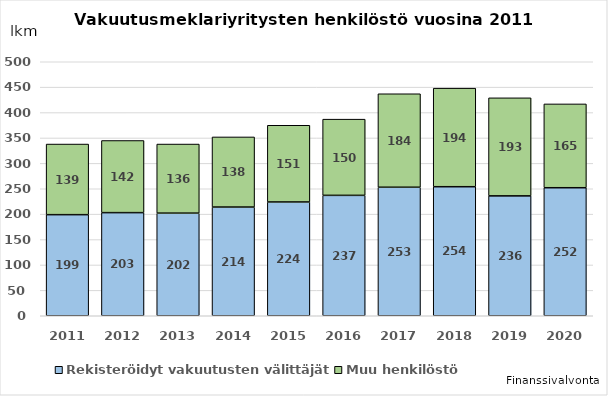
| Category | Rekisteröidyt vakuutusten välittäjät  | Muu henkilöstö |
|---|---|---|
| 2011.0 | 199 | 139 |
| 2012.0 | 203 | 142 |
| 2013.0 | 202 | 136 |
| 2014.0 | 214 | 138 |
| 2015.0 | 224 | 151 |
| 2016.0 | 237 | 150 |
| 2017.0 | 253 | 184 |
| 2018.0 | 254 | 194 |
| 2019.0 | 236 | 193 |
| 2020.0 | 252 | 165 |